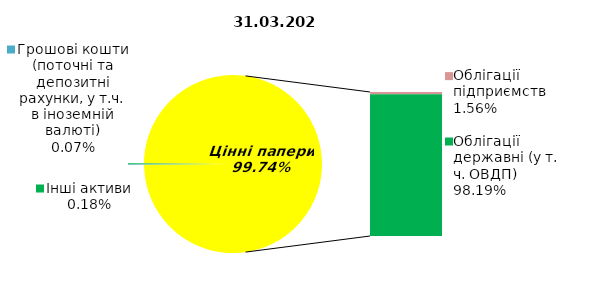
| Category | Series 0 |
|---|---|
| Грошові кошти (поточні та депозитні рахунки, у т.ч. в іноземній валюті) | 0.12 |
| Банківські метали | 0 |
| Нерухомість | 0 |
| Інші активи | 0.31 |
| Акції | 0 |
| Облігації підприємств | 2.618 |
| Муніципальні облігації | 0 |
| Облігації державні (у т. ч. ОВДП) | 165.071 |
| Іпотечні сертифікати | 0 |